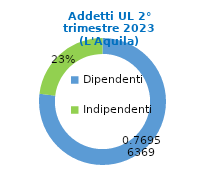
| Category | Series 0 |
|---|---|
| Dipendenti | 61345 |
| Indipendenti | 18369 |